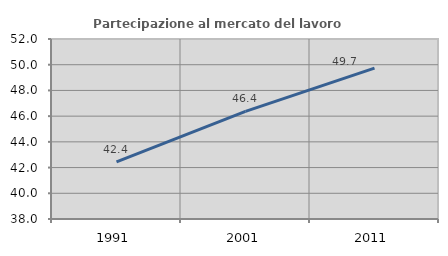
| Category | Partecipazione al mercato del lavoro  femminile |
|---|---|
| 1991.0 | 42.449 |
| 2001.0 | 46.365 |
| 2011.0 | 49.733 |